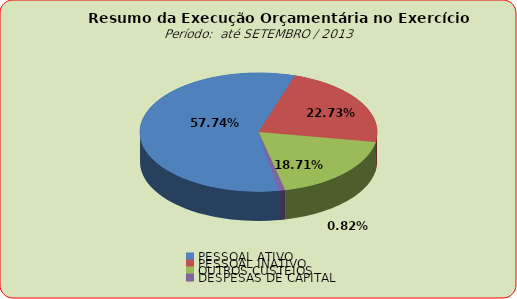
| Category | Series 0 |
|---|---|
| PESSOAL ATIVO | 70739214.32 |
| PESSOAL INATIVO | 27844505.76 |
| OUTROS CUSTEIOS | 22928133.4 |
| DESPESAS DE CAPITAL | 1006882.68 |